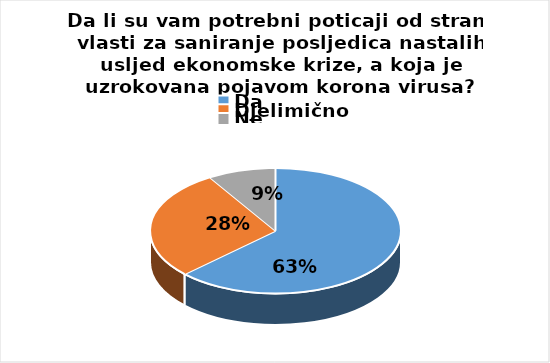
| Category | Series 0 |
|---|---|
| Da | 215 |
| Djelimično | 97 |
| Ne | 30 |